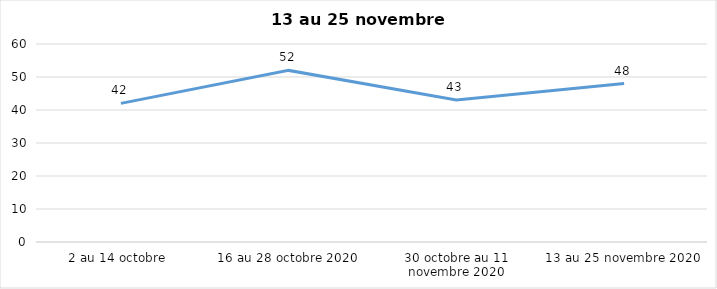
| Category | Series 0 |
|---|---|
| 2 au 14 octobre  | 42 |
| 16 au 28 octobre 2020 | 52 |
| 30 octobre au 11 novembre 2020 | 43 |
| 13 au 25 novembre 2020 | 48 |